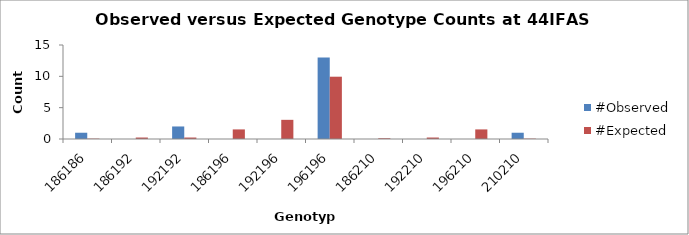
| Category | #Observed | #Expected |
|---|---|---|
| 186186.0 | 1 | 0.059 |
| 186192.0 | 0 | 0.235 |
| 192192.0 | 2 | 0.235 |
| 186196.0 | 0 | 1.529 |
| 192196.0 | 0 | 3.059 |
| 196196.0 | 13 | 9.941 |
| 186210.0 | 0 | 0.118 |
| 192210.0 | 0 | 0.235 |
| 196210.0 | 0 | 1.529 |
| 210210.0 | 1 | 0.059 |